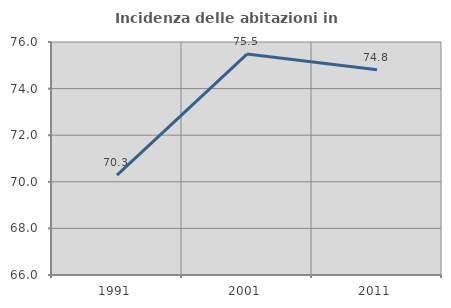
| Category | Incidenza delle abitazioni in proprietà  |
|---|---|
| 1991.0 | 70.285 |
| 2001.0 | 75.481 |
| 2011.0 | 74.808 |